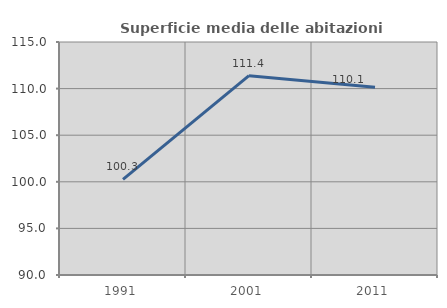
| Category | Superficie media delle abitazioni occupate |
|---|---|
| 1991.0 | 100.252 |
| 2001.0 | 111.387 |
| 2011.0 | 110.137 |